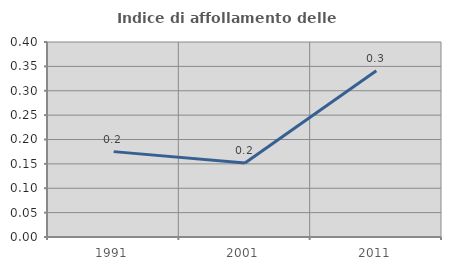
| Category | Indice di affollamento delle abitazioni  |
|---|---|
| 1991.0 | 0.175 |
| 2001.0 | 0.152 |
| 2011.0 | 0.341 |